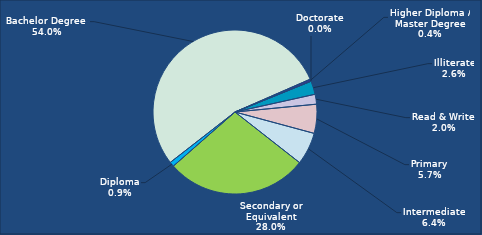
| Category | Series 0 |
|---|---|
| 0 | 2.641 |
| 1 | 1.947 |
| 2 | 5.722 |
| 3 | 6.384 |
| 4 | 27.955 |
| 5 | 0.931 |
| 6 | 53.983 |
| 7 | 0.422 |
| 8 | 0.016 |